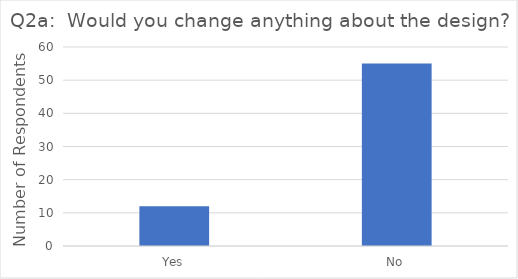
| Category | Series 0 |
|---|---|
| Yes | 12 |
| No | 55 |